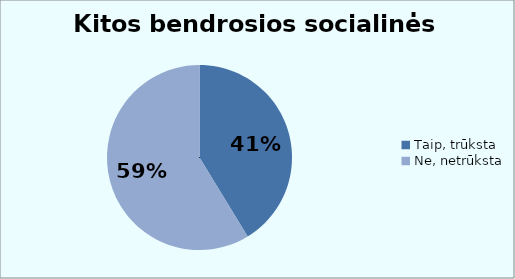
| Category | Series 0 |
|---|---|
| Taip, trūksta | 45 |
| Ne, netrūksta | 64 |